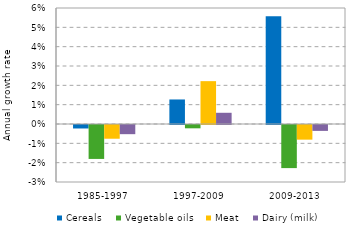
| Category | Cereals | Vegetable oils | Meat | Dairy (milk) |
|---|---|---|---|---|
| 1985-1997 | -0.002 | -0.018 | -0.007 | -0.005 |
| 1997-2009 | 0.013 | -0.002 | 0.022 | 0.006 |
| 2009-2013 | 0.056 | -0.022 | -0.008 | -0.003 |